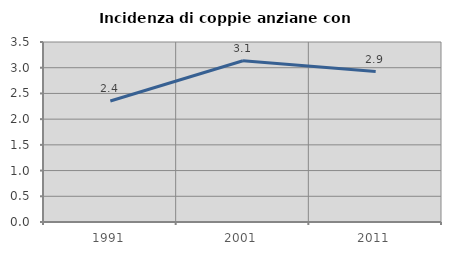
| Category | Incidenza di coppie anziane con figli |
|---|---|
| 1991.0 | 2.352 |
| 2001.0 | 3.134 |
| 2011.0 | 2.925 |